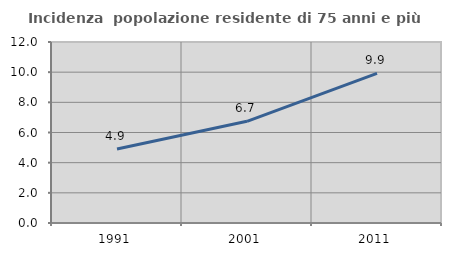
| Category | Incidenza  popolazione residente di 75 anni e più |
|---|---|
| 1991.0 | 4.903 |
| 2001.0 | 6.743 |
| 2011.0 | 9.925 |